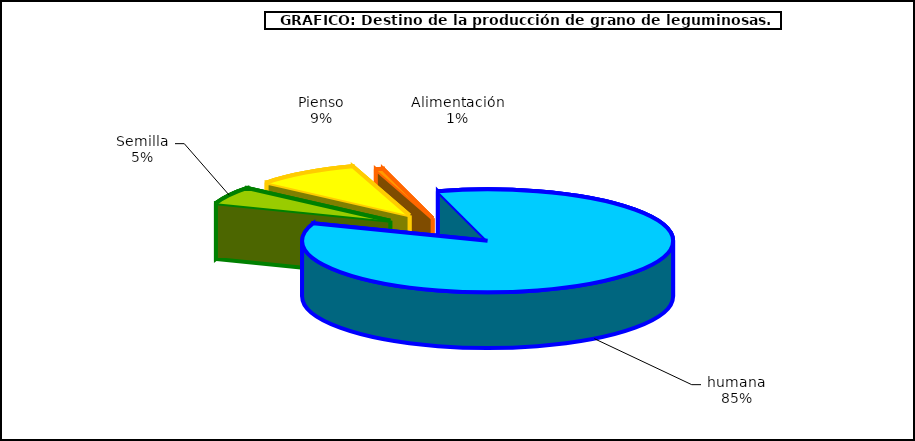
| Category | Series 0 |
|---|---|
| 0 | 35239 |
| 1 | 58620 |
| 2 | 4116 |
| 3 | 549745 |